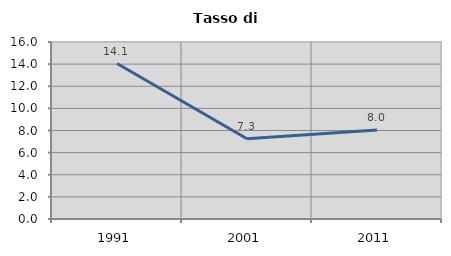
| Category | Tasso di disoccupazione   |
|---|---|
| 1991.0 | 14.052 |
| 2001.0 | 7.255 |
| 2011.0 | 8.048 |